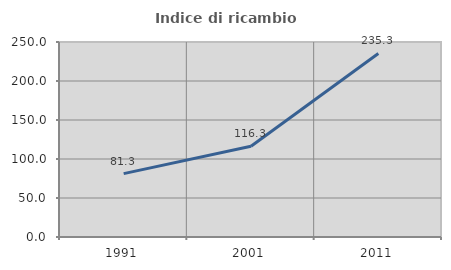
| Category | Indice di ricambio occupazionale  |
|---|---|
| 1991.0 | 81.271 |
| 2001.0 | 116.34 |
| 2011.0 | 235.345 |